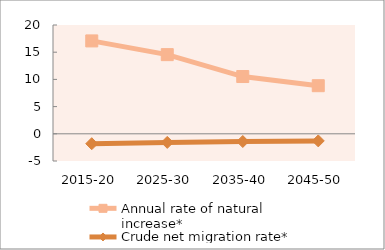
| Category | Annual rate of natural increase* | Crude net migration rate* |
|---|---|---|
| 2015-20 | 17.075 | -1.822 |
| 2025-30 | 14.552 | -1.58 |
| 2035-40 | 10.528 | -1.416 |
| 2045-50 | 8.842 | -1.305 |